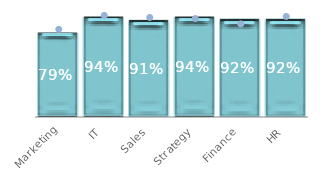
| Category | Series 0 |
|---|---|
| Marketing | 0.79 |
| IT | 0.94 |
| Sales | 0.91 |
| Strategy | 0.94 |
| Finance | 0.92 |
| HR | 0.92 |